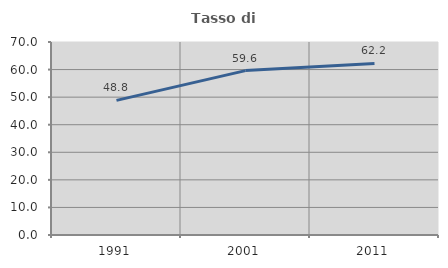
| Category | Tasso di occupazione   |
|---|---|
| 1991.0 | 48.837 |
| 2001.0 | 59.62 |
| 2011.0 | 62.217 |